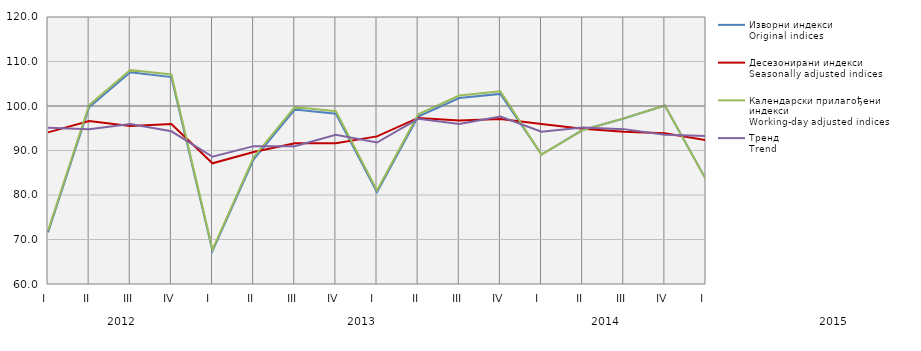
| Category | Изворни индекси
Original indices | Десезонирани индекси
Seasonally adjusted indices | Календарски прилагођени индекси
Working-day adjusted indices | Тренд
Trend |
|---|---|---|---|---|
| I  | 71.601 | 94.079 | 71.98 | 95.121 |
| II | 99.705 | 96.642 | 100.233 | 94.771 |
| III | 107.6 | 95.493 | 108.095 | 95.926 |
| IV | 106.508 | 95.937 | 107.102 | 94.311 |
| I  | 67.411 | 87.117 | 67.744 | 88.596 |
| II | 88.026 | 89.673 | 88.493 | 90.981 |
| III | 99.2 | 91.613 | 99.754 | 90.959 |
| IV | 98.255 | 91.651 | 98.807 | 93.536 |
| I  | 80.624 | 93.175 | 81.025 | 91.788 |
| II | 97.612 | 97.315 | 98.129 | 97.13 |
| III | 101.777 | 96.742 | 102.345 | 95.943 |
| IV | 102.721 | 97.086 | 103.296 | 97.631 |
| I  | 89.1 | 95.943 | 89.069 | 94.217 |
| II | 94.6 | 94.912 | 94.58 | 95.145 |
| III | 97.2 | 94.192 | 97.22 | 94.802 |
| IV | 100.1 | 93.899 | 100.126 | 93.529 |
| I  | 83.476 | 92.304 | 83.476 | 93.254 |